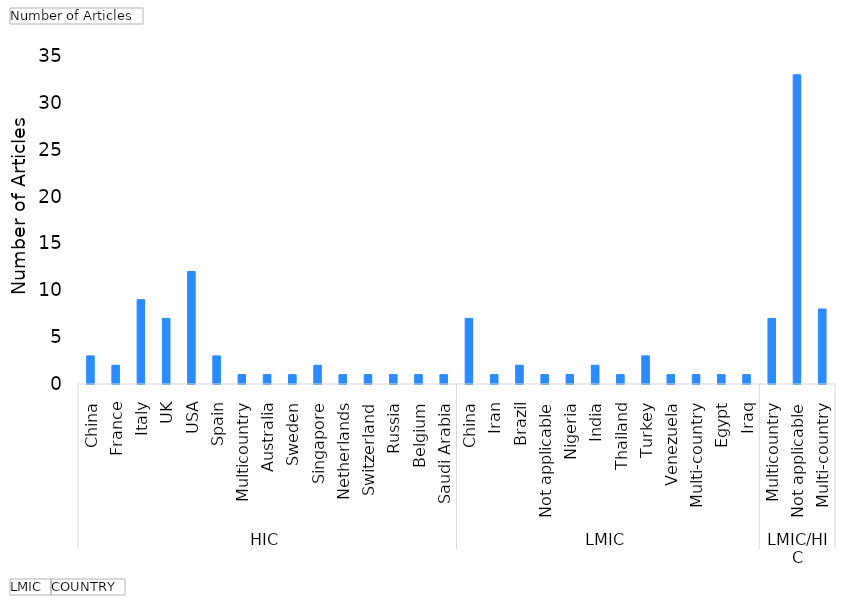
| Category | Total |
|---|---|
| 0 | 3 |
| 1 | 2 |
| 2 | 9 |
| 3 | 7 |
| 4 | 12 |
| 5 | 3 |
| 6 | 1 |
| 7 | 1 |
| 8 | 1 |
| 9 | 2 |
| 10 | 1 |
| 11 | 1 |
| 12 | 1 |
| 13 | 1 |
| 14 | 1 |
| 15 | 7 |
| 16 | 1 |
| 17 | 2 |
| 18 | 1 |
| 19 | 1 |
| 20 | 2 |
| 21 | 1 |
| 22 | 3 |
| 23 | 1 |
| 24 | 1 |
| 25 | 1 |
| 26 | 1 |
| 27 | 7 |
| 28 | 33 |
| 29 | 8 |